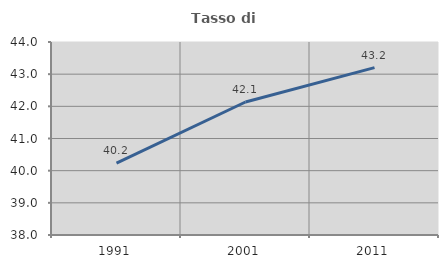
| Category | Tasso di occupazione   |
|---|---|
| 1991.0 | 40.236 |
| 2001.0 | 42.135 |
| 2011.0 | 43.202 |